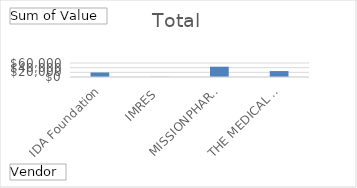
| Category | Total |
|---|---|
| IDA Foundation | 19340 |
| IMRES | 840 |
| MISSIONPHARMA A/S | 44152.4 |
| THE MEDICAL EXPORT GROUP BV | 25385 |